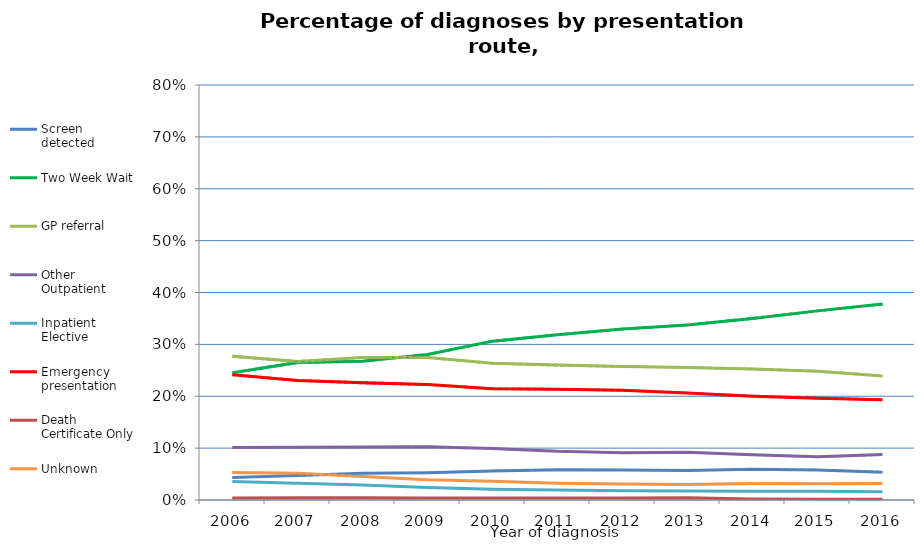
| Category | Screen detected | Two Week Wait | GP referral | Other Outpatient | Inpatient Elective | Emergency presentation | Death Certificate Only | Unknown | SD LCI | SD UCI | TWW LCI | TWW UCI | GP LCI | GP UCI | OO LCI | OO UCI | IP LCI | IP UCI | EP LCI | EP UCI | DCO LCI | DCO UCI | UNK LCI | UNK UCI |
|---|---|---|---|---|---|---|---|---|---|---|---|---|---|---|---|---|---|---|---|---|---|---|---|---|
| 2006.0 | 0.043 | 0.245 | 0.277 | 0.101 | 0.035 | 0.241 | 0.004 | 0.053 | 0.043 | 0.044 | 0.244 | 0.247 | 0.275 | 0.279 | 0.1 | 0.102 | 0.035 | 0.036 | 0.24 | 0.243 | 0.004 | 0.004 | 0.052 | 0.054 |
| 2007.0 | 0.047 | 0.265 | 0.267 | 0.102 | 0.032 | 0.231 | 0.004 | 0.052 | 0.046 | 0.048 | 0.263 | 0.267 | 0.265 | 0.269 | 0.101 | 0.103 | 0.032 | 0.033 | 0.229 | 0.232 | 0.004 | 0.005 | 0.051 | 0.053 |
| 2008.0 | 0.052 | 0.267 | 0.275 | 0.102 | 0.029 | 0.226 | 0.004 | 0.045 | 0.051 | 0.052 | 0.266 | 0.269 | 0.273 | 0.276 | 0.101 | 0.103 | 0.028 | 0.03 | 0.224 | 0.228 | 0.004 | 0.005 | 0.044 | 0.046 |
| 2009.0 | 0.053 | 0.28 | 0.275 | 0.103 | 0.024 | 0.223 | 0.004 | 0.039 | 0.052 | 0.053 | 0.279 | 0.282 | 0.273 | 0.276 | 0.102 | 0.104 | 0.023 | 0.025 | 0.221 | 0.224 | 0.004 | 0.004 | 0.039 | 0.04 |
| 2010.0 | 0.056 | 0.306 | 0.264 | 0.099 | 0.02 | 0.215 | 0.004 | 0.036 | 0.055 | 0.057 | 0.304 | 0.308 | 0.262 | 0.265 | 0.098 | 0.1 | 0.02 | 0.021 | 0.213 | 0.216 | 0.004 | 0.004 | 0.036 | 0.037 |
| 2011.0 | 0.058 | 0.319 | 0.26 | 0.094 | 0.019 | 0.214 | 0.004 | 0.033 | 0.057 | 0.059 | 0.317 | 0.32 | 0.258 | 0.262 | 0.093 | 0.095 | 0.019 | 0.02 | 0.212 | 0.215 | 0.004 | 0.004 | 0.032 | 0.033 |
| 2012.0 | 0.058 | 0.329 | 0.257 | 0.091 | 0.018 | 0.212 | 0.004 | 0.031 | 0.057 | 0.059 | 0.328 | 0.331 | 0.256 | 0.259 | 0.09 | 0.092 | 0.017 | 0.018 | 0.21 | 0.213 | 0.004 | 0.004 | 0.03 | 0.031 |
| 2013.0 | 0.057 | 0.337 | 0.256 | 0.092 | 0.018 | 0.206 | 0.004 | 0.03 | 0.056 | 0.058 | 0.336 | 0.339 | 0.254 | 0.257 | 0.091 | 0.093 | 0.017 | 0.018 | 0.205 | 0.207 | 0.004 | 0.005 | 0.029 | 0.031 |
| 2014.0 | 0.059 | 0.35 | 0.252 | 0.087 | 0.017 | 0.2 | 0.002 | 0.032 | 0.059 | 0.06 | 0.348 | 0.352 | 0.251 | 0.254 | 0.086 | 0.088 | 0.017 | 0.017 | 0.199 | 0.202 | 0.002 | 0.002 | 0.031 | 0.033 |
| 2015.0 | 0.058 | 0.365 | 0.248 | 0.083 | 0.017 | 0.196 | 0.001 | 0.031 | 0.057 | 0.059 | 0.363 | 0.366 | 0.247 | 0.25 | 0.082 | 0.084 | 0.017 | 0.018 | 0.195 | 0.198 | 0.001 | 0.002 | 0.031 | 0.032 |
| 2016.0 | 0.054 | 0.378 | 0.239 | 0.087 | 0.016 | 0.193 | 0.001 | 0.032 | 0.053 | 0.055 | 0.376 | 0.379 | 0.238 | 0.241 | 0.086 | 0.089 | 0.015 | 0.016 | 0.192 | 0.195 | 0.001 | 0.001 | 0.031 | 0.032 |